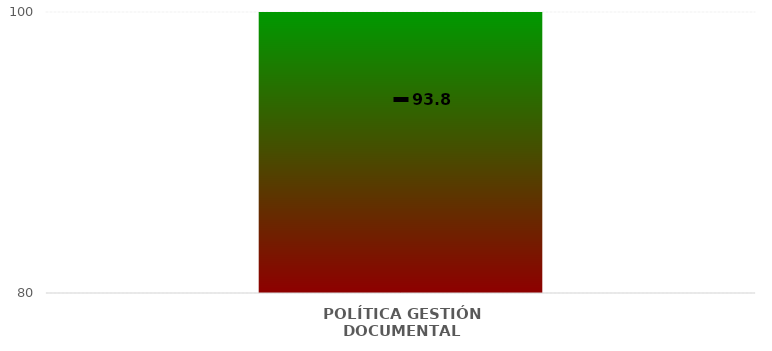
| Category | Niveles |
|---|---|
| POLÍTICA GESTIÓN DOCUMENTAL | 100 |